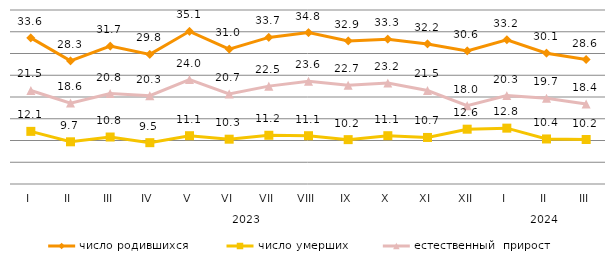
| Category | число родившихся  | число умерших | естественный  прирост |
|---|---|---|---|
| 0 | 33.6 | 12.1 | 21.5 |
| 1 | 28.3 | 9.7 | 18.6 |
| 2 | 31.7 | 10.8 | 20.8 |
| 3 | 29.8 | 9.5 | 20.3 |
| 4 | 35.1 | 11.1 | 24 |
| 5 | 31 | 10.3 | 20.7 |
| 6 | 33.7 | 11.2 | 22.5 |
| 7 | 34.8 | 11.1 | 23.6 |
| 8 | 32.9 | 10.2 | 22.7 |
| 9 | 33.3 | 11.1 | 23.2 |
| 10 | 32.2 | 10.7 | 21.5 |
| 11 | 30.6 | 12.6 | 18 |
| 12 | 33.162 | 12.84 | 20.322 |
| 13 | 30.075 | 10.352 | 19.723 |
| 14 | 28.614 | 10.224 | 18.39 |